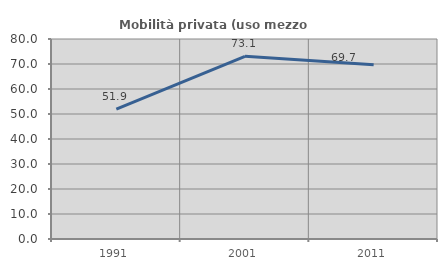
| Category | Mobilità privata (uso mezzo privato) |
|---|---|
| 1991.0 | 51.917 |
| 2001.0 | 73.077 |
| 2011.0 | 69.713 |